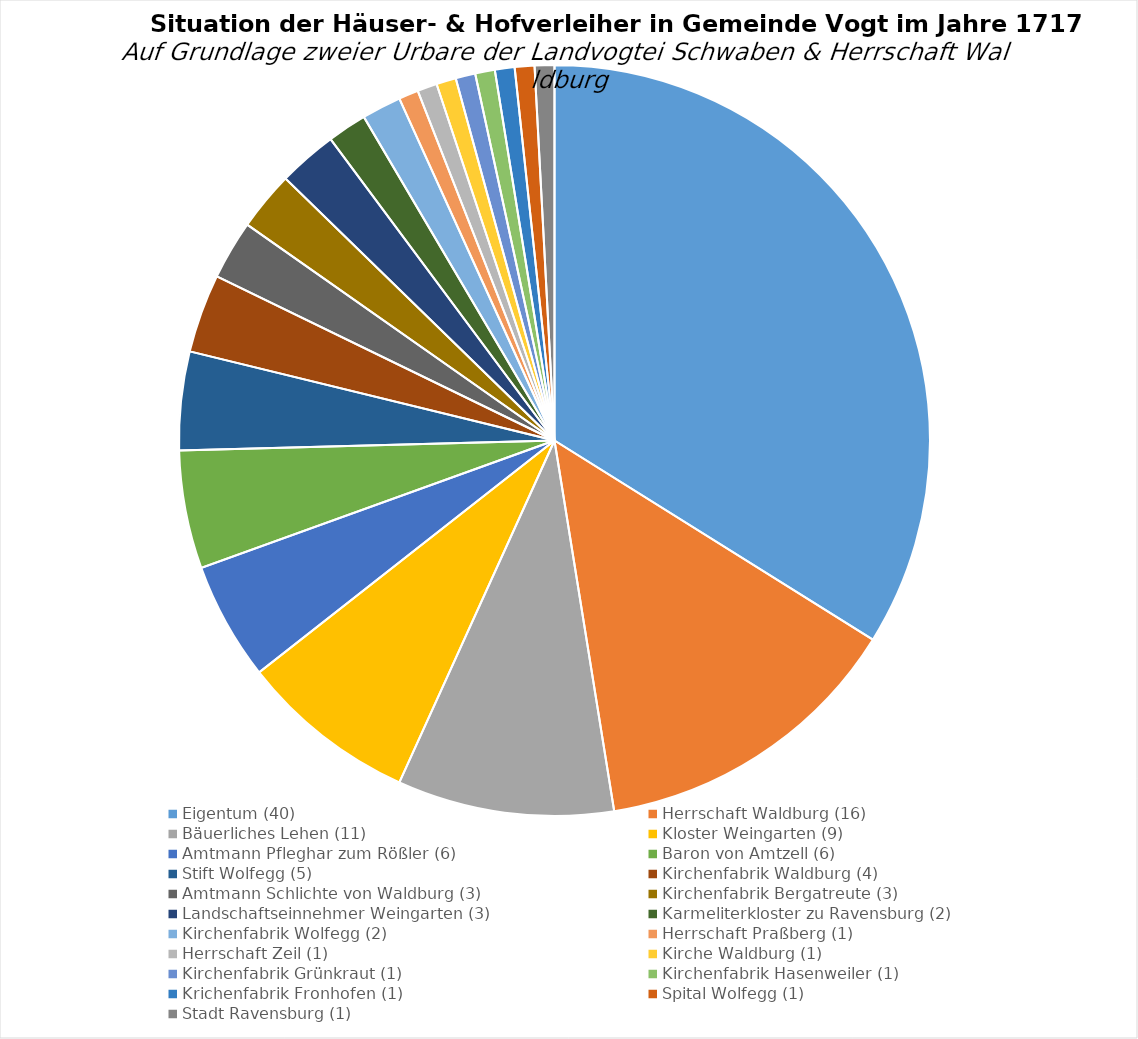
| Category | Series 0 |
|---|---|
| Eigentum (40) | 40 |
| Herrschaft Waldburg (16) | 16 |
| Bäuerliches Lehen (11) | 11 |
| Kloster Weingarten (9) | 9 |
| Amtmann Pfleghar zum Rößler (6) | 6 |
| Baron von Amtzell (6) | 6 |
| Stift Wolfegg (5) | 5 |
| Kirchenfabrik Waldburg (4) | 4 |
| Amtmann Schlichte von Waldburg (3) | 3 |
| Kirchenfabrik Bergatreute (3) | 3 |
| Landschaftseinnehmer Weingarten (3) | 3 |
| Karmeliterkloster zu Ravensburg (2) | 2 |
| Kirchenfabrik Wolfegg (2) | 2 |
| Herrschaft Praßberg (1) | 1 |
| Herrschaft Zeil (1) | 1 |
| Kirche Waldburg (1) | 1 |
| Kirchenfabrik Grünkraut (1) | 1 |
| Kirchenfabrik Hasenweiler (1) | 1 |
| Krichenfabrik Fronhofen (1) | 1 |
| Spital Wolfegg (1) | 1 |
| Stadt Ravensburg (1) | 1 |